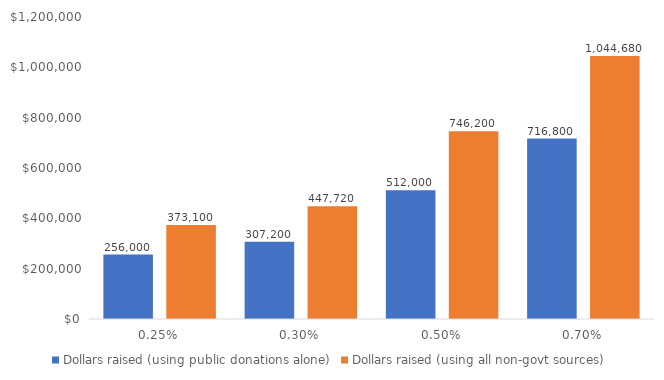
| Category | Dollars raised (using public donations alone) | Dollars raised (using all non-govt sources) |
|---|---|---|
| 0.0025 | 256000 | 373100 |
| 0.003 | 307200 | 447720 |
| 0.005 | 512000 | 746200 |
| 0.006999999999999999 | 716800 | 1044680 |